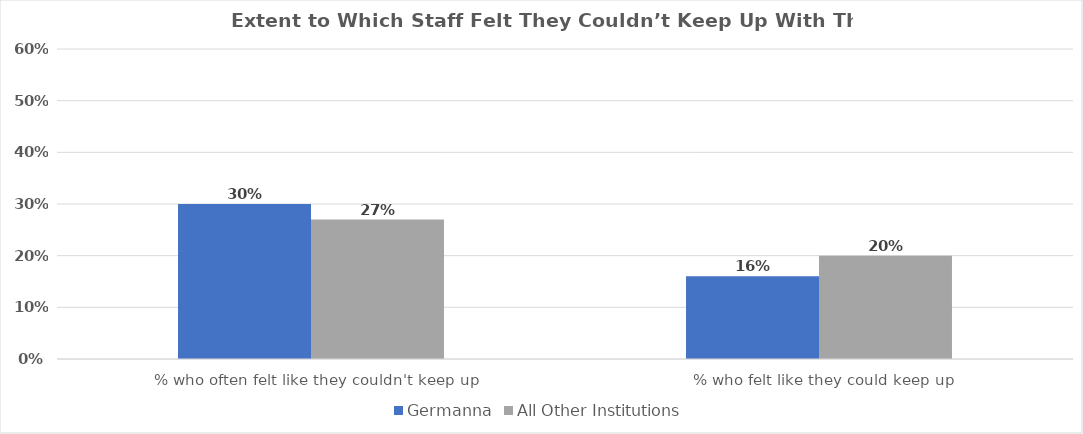
| Category | Germanna | All Other Institutions |
|---|---|---|
| % who often felt like they couldn't keep up
 | 0.3 | 0.27 |
| % who felt like they could keep up
 | 0.16 | 0.2 |